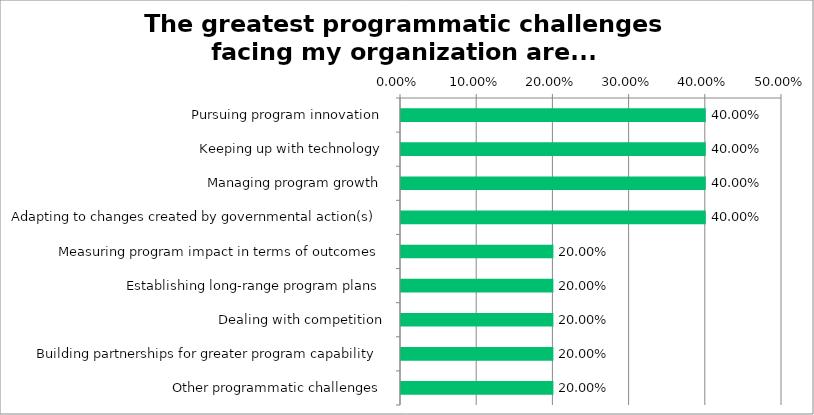
| Category | Responses |
|---|---|
| Pursuing program innovation | 0.4 |
| Keeping up with technology | 0.4 |
| Managing program growth | 0.4 |
| Adapting to changes created by governmental action(s) | 0.4 |
| Measuring program impact in terms of outcomes | 0.2 |
| Establishing long-range program plans | 0.2 |
| Dealing with competition | 0.2 |
| Building partnerships for greater program capability | 0.2 |
| Other programmatic challenges | 0.2 |